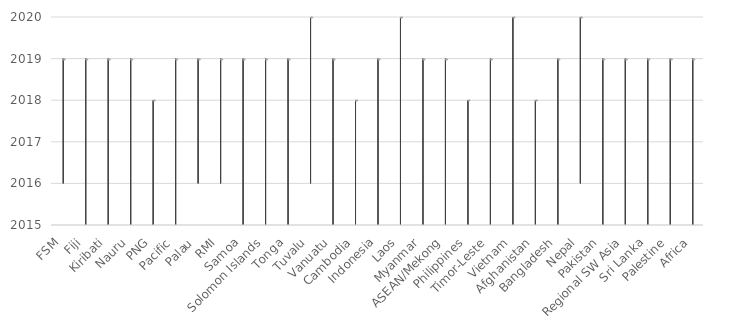
| Category | Start | Middle | End |
|---|---|---|---|
| FSM | 2016 | 2018 | 2019 |
| Fiji | 2015 | 2018 | 2019 |
| Kiribati | 2015 | 2018 | 2019 |
| Nauru | 2015 | 2018 | 2019 |
| PNG | 2015 | 2018 | 2018 |
| Pacific | 2015 | 2018 | 2019 |
| Palau | 2016 | 2018 | 2019 |
| RMI | 2016 | 2018 | 2019 |
| Samoa | 2015 | 2018 | 2019 |
| Solomon Islands | 2015 | 2018 | 2019 |
| Tonga | 2015 | 2018 | 2019 |
| Tuvalu | 2016 | 2018 | 2020 |
| Vanuatu | 2015 | 2018 | 2019 |
| Cambodia | 2015 | 2018 | 2018 |
| Indonesia | 2015 | 2018 | 2019 |
| Laos | 2015 | 2018 | 2020 |
| Myanmar | 2015 | 2018 | 2019 |
| ASEAN/Mekong | 2015 | 2018 | 2019 |
| Philippines | 2015 | 2018 | 2018 |
| Timor-Leste | 2015 | 2018 | 2019 |
| Vietnam | 2015 | 2018 | 2020 |
| Afghanistan | 2015 | 2018 | 2018 |
| Bangladesh | 2015 | 2018 | 2019 |
| Nepal | 2016 | 2018 | 2020 |
| Pakistan | 2015 | 2018 | 2019 |
| Regional SW Asia | 2015 | 2018 | 2019 |
| Sri Lanka | 2015 | 2018 | 2019 |
| Palestine | 2015 | 2018 | 2019 |
| Africa | 2015 | 2018 | 2019 |